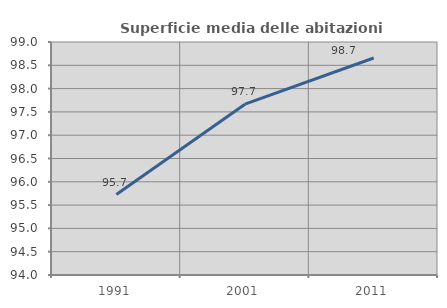
| Category | Superficie media delle abitazioni occupate |
|---|---|
| 1991.0 | 95.726 |
| 2001.0 | 97.666 |
| 2011.0 | 98.656 |